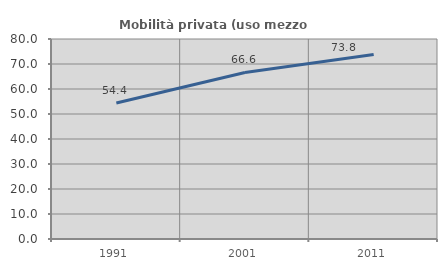
| Category | Mobilità privata (uso mezzo privato) |
|---|---|
| 1991.0 | 54.416 |
| 2001.0 | 66.616 |
| 2011.0 | 73.797 |